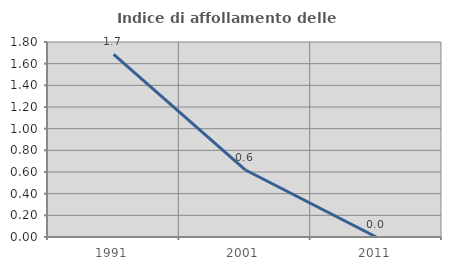
| Category | Indice di affollamento delle abitazioni  |
|---|---|
| 1991.0 | 1.685 |
| 2001.0 | 0.621 |
| 2011.0 | 0 |